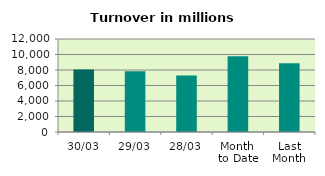
| Category | Series 0 |
|---|---|
| 30/03 | 8073.232 |
| 29/03 | 7849.438 |
| 28/03 | 7292.821 |
| Month 
to Date | 9763.204 |
| Last
Month | 8884.685 |